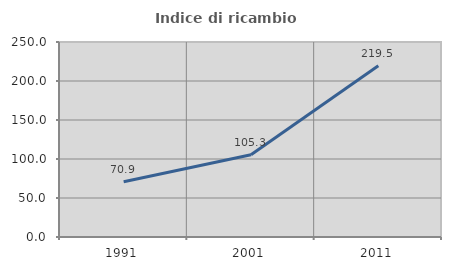
| Category | Indice di ricambio occupazionale  |
|---|---|
| 1991.0 | 70.942 |
| 2001.0 | 105.342 |
| 2011.0 | 219.505 |